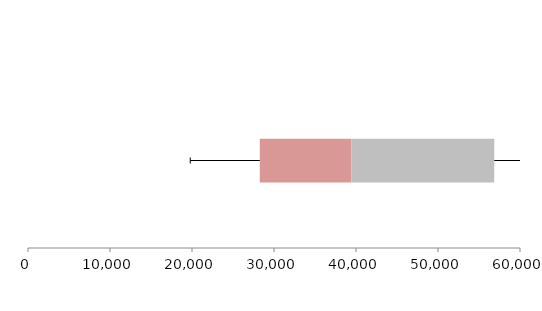
| Category | Series 1 | Series 2 | Series 3 |
|---|---|---|---|
| 0 | 28269.796 | 11176.225 | 17412.885 |